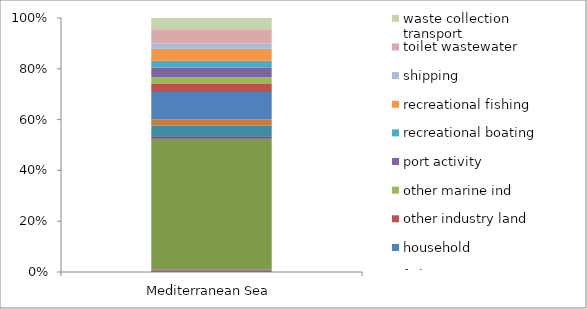
| Category | agriculture | aquaculture | coast beach tourism | construction and demolition | dumps and landfills | fishing | household | other industry land | other marine ind | port activity | recreational boating | recreational fishing | shipping | toilet wastewater | waste collection transport |
|---|---|---|---|---|---|---|---|---|---|---|---|---|---|---|---|
| Mediterranean Sea | 3603 | 1961.25 | 316005.25 | 5919 | 25483.25 | 15997.75 | 65346.25 | 19180.5 | 17063.5 | 22718.5 | 16351.5 | 29325 | 12328.5 | 34722.5 | 27094 |